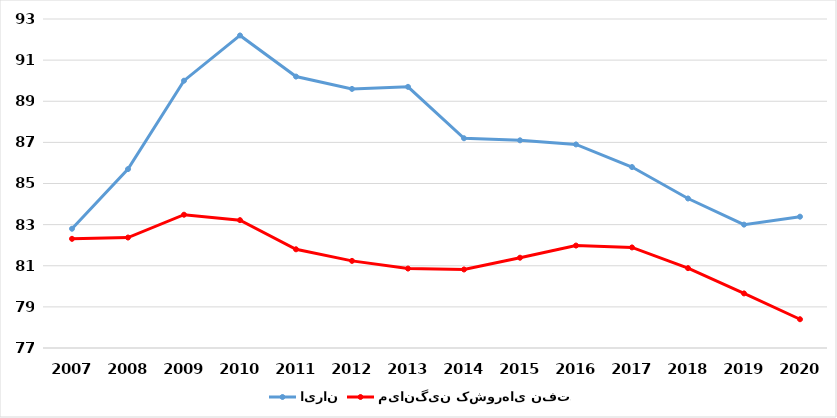
| Category | ایران | میانگین کشورهای نفتی |
|---|---|---|
| 2007.0 | 82.8 | 82.309 |
| 2008.0 | 85.7 | 82.373 |
| 2009.0 | 90 | 83.482 |
| 2010.0 | 92.2 | 83.218 |
| 2011.0 | 90.2 | 81.8 |
| 2012.0 | 89.6 | 81.236 |
| 2013.0 | 89.7 | 80.864 |
| 2014.0 | 87.2 | 80.818 |
| 2015.0 | 87.1 | 81.391 |
| 2016.0 | 86.9 | 81.982 |
| 2017.0 | 85.8 | 81.891 |
| 2018.0 | 84.271 | 80.884 |
| 2019.0 | 83 | 79.655 |
| 2020.0 | 83.387 | 78.398 |